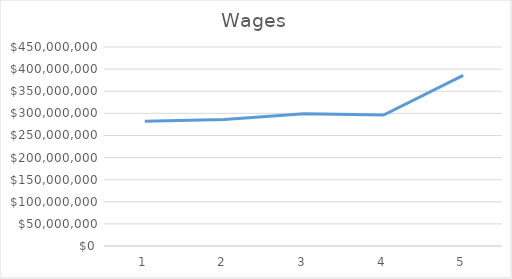
| Category | Series 0 |
|---|---|
| 0 | 281886000 |
| 1 | 286160000 |
| 2 | 298924000 |
| 3 | 296110000 |
| 4 | 385870000 |